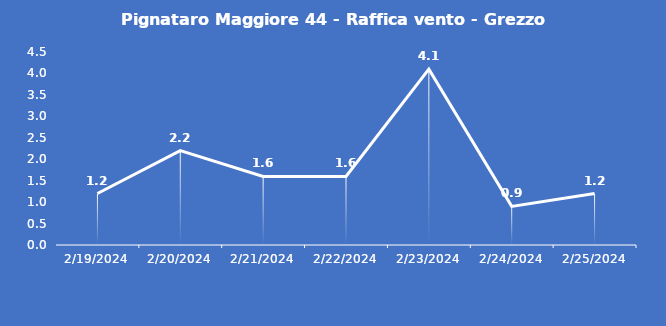
| Category | Pignataro Maggiore 44 - Raffica vento - Grezzo (m/s) |
|---|---|
| 2/19/24 | 1.2 |
| 2/20/24 | 2.2 |
| 2/21/24 | 1.6 |
| 2/22/24 | 1.6 |
| 2/23/24 | 4.1 |
| 2/24/24 | 0.9 |
| 2/25/24 | 1.2 |